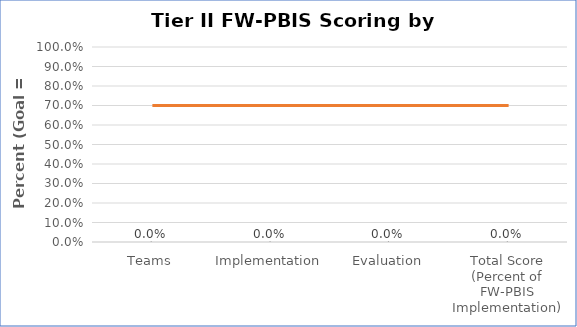
| Category | Series 0 |
|---|---|
| Teams | 0 |
| Implementation | 0 |
| Evaluation | 0 |
| Total Score (Percent of FW-PBIS Implementation) | 0 |